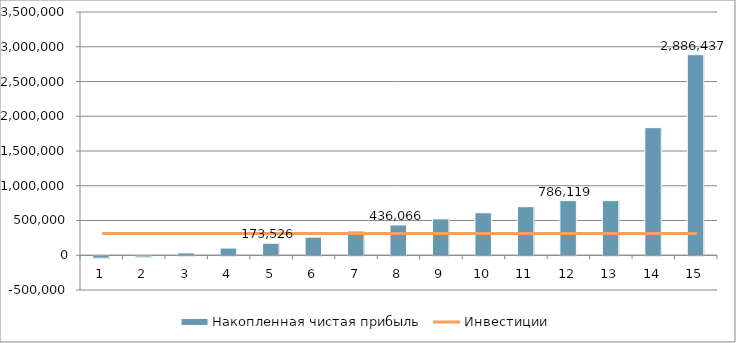
| Category | Накопленная чистая прибыль |
|---|---|
| 0 | -35705.581 |
| 1 | -18603.092 |
| 2 | 33704.775 |
| 3 | 103615.333 |
| 4 | 173525.89 |
| 5 | 261039.138 |
| 6 | 348552.385 |
| 7 | 436065.632 |
| 8 | 523578.879 |
| 9 | 611092.127 |
| 10 | 698605.374 |
| 11 | 786118.621 |
| 12 | 786118.621 |
| 13 | 1836277.588 |
| 14 | 2886436.555 |